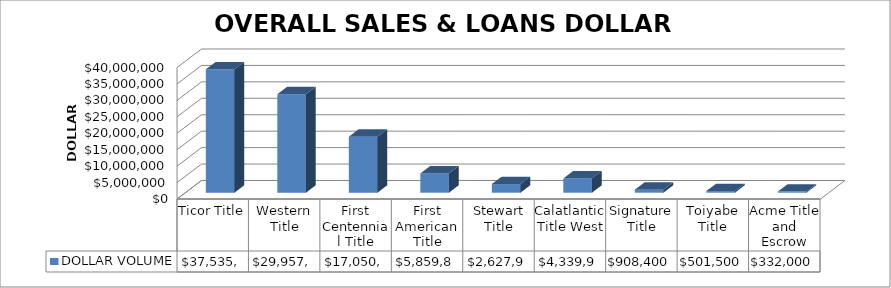
| Category | DOLLAR VOLUME |
|---|---|
| Ticor Title | 37535724 |
| Western Title | 29957772 |
| First Centennial Title | 17050958 |
| First American Title | 5859867 |
| Stewart Title | 2627990 |
| Calatlantic Title West | 4339914 |
| Signature Title | 908400 |
| Toiyabe Title | 501500 |
| Acme Title and Escrow | 332000 |